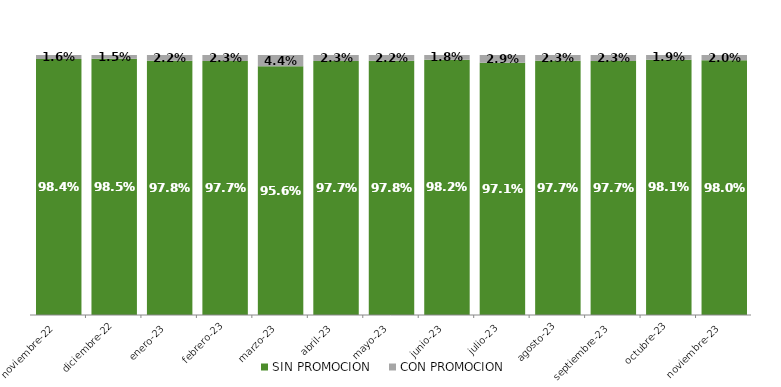
| Category | SIN PROMOCION   | CON PROMOCION   |
|---|---|---|
| 2022-11-01 | 0.984 | 0.016 |
| 2022-12-01 | 0.985 | 0.015 |
| 2023-01-01 | 0.978 | 0.022 |
| 2023-02-01 | 0.977 | 0.023 |
| 2023-03-01 | 0.956 | 0.044 |
| 2023-04-01 | 0.977 | 0.023 |
| 2023-05-01 | 0.978 | 0.022 |
| 2023-06-01 | 0.982 | 0.018 |
| 2023-07-01 | 0.971 | 0.029 |
| 2023-08-01 | 0.977 | 0.023 |
| 2023-09-01 | 0.977 | 0.023 |
| 2023-10-01 | 0.981 | 0.019 |
| 2023-11-01 | 0.98 | 0.02 |